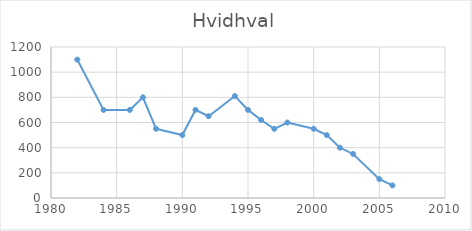
| Category | Series 0 |
|---|---|
| 1982.0 | 1100 |
| 1984.0 | 700 |
| 1986.0 | 700 |
| 1987.0 | 800 |
| 1988.0 | 550 |
| 1990.0 | 500 |
| 1991.0 | 700 |
| 1992.0 | 650 |
| 1994.0 | 810 |
| 1995.0 | 700 |
| 1996.0 | 620 |
| 1997.0 | 550 |
| 1998.0 | 600 |
| 2000.0 | 550 |
| 2001.0 | 500 |
| 2002.0 | 400 |
| 2003.0 | 350 |
| 2005.0 | 150 |
| 2006.0 | 100 |